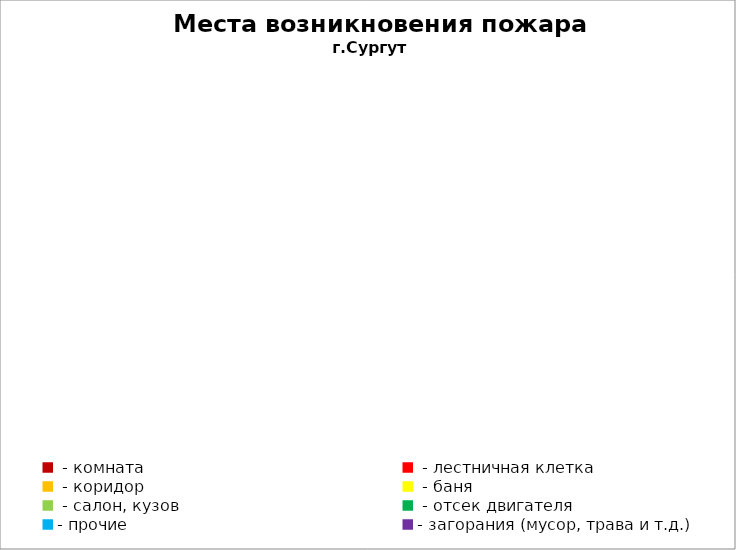
| Category | Места возникновения пожара |
|---|---|
|  - комната | 34 |
|  - лестничная клетка | 5 |
|  - коридор | 7 |
|  - баня | 9 |
|  - салон, кузов | 16 |
|  - отсек двигателя | 31 |
| - прочие | 103 |
| - загорания (мусор, трава и т.д.)  | 92 |